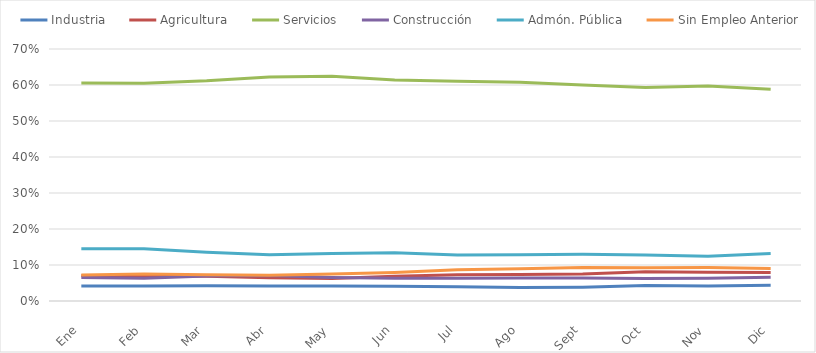
| Category | Industria | Agricultura | Servicios | Construcción | Admón. Pública | Sin Empleo Anterior |
|---|---|---|---|---|---|---|
| Ene | 0.042 | 0.07 | 0.605 | 0.066 | 0.145 | 0.072 |
| Feb | 0.042 | 0.07 | 0.605 | 0.063 | 0.145 | 0.075 |
| Mar | 0.042 | 0.069 | 0.612 | 0.069 | 0.135 | 0.073 |
| Abr | 0.042 | 0.065 | 0.622 | 0.071 | 0.128 | 0.072 |
| May | 0.042 | 0.062 | 0.624 | 0.065 | 0.132 | 0.075 |
| Jun | 0.041 | 0.069 | 0.614 | 0.063 | 0.134 | 0.079 |
| Jul | 0.039 | 0.073 | 0.611 | 0.063 | 0.128 | 0.087 |
| Ago | 0.037 | 0.073 | 0.608 | 0.064 | 0.128 | 0.09 |
| Sept | 0.038 | 0.075 | 0.6 | 0.064 | 0.13 | 0.093 |
| Oct | 0.043 | 0.081 | 0.593 | 0.062 | 0.128 | 0.092 |
| Nov | 0.042 | 0.08 | 0.598 | 0.063 | 0.124 | 0.093 |
| Dic | 0.044 | 0.079 | 0.588 | 0.066 | 0.132 | 0.091 |